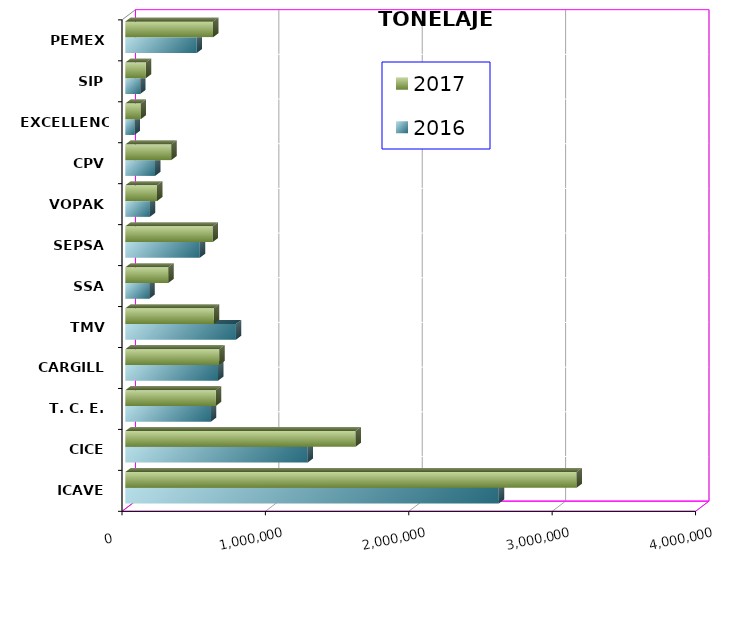
| Category | 2016 | 2017 |
|---|---|---|
| ICAVE | 2604592.93 | 3147113.022 |
| CICE | 1271469.618 | 1605426.339 |
| T. C. E. | 597490.569 | 631863.676 |
| CARGILL | 646951.534 | 655434.359 |
| TMV | 771621.691 | 617823.39 |
| SSA | 167401.488 | 299633.472 |
| SEPSA | 519397.114 | 609666.65 |
| VOPAK | 171311.654 | 221017.38 |
| CPV | 207626.206 | 320530.81 |
| EXCELLENCE | 64334.807 | 107522.917 |
| SIP | 104055.34 | 143466.06 |
| PEMEX | 498036.975 | 611995.876 |